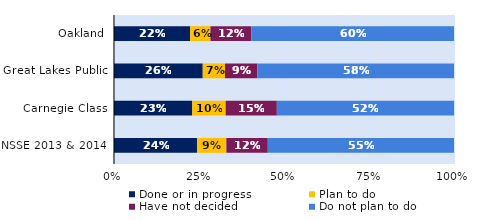
| Category | Done or in progress | Plan to do | Have not decided | Do not plan to do |
|---|---|---|---|---|
| Oakland | 0.224 | 0.06 | 0.12 | 0.596 |
| Great Lakes Public | 0.261 | 0.065 | 0.095 | 0.579 |
| Carnegie Class | 0.23 | 0.098 | 0.151 | 0.521 |
| NSSE 2013 & 2014 | 0.245 | 0.086 | 0.122 | 0.548 |